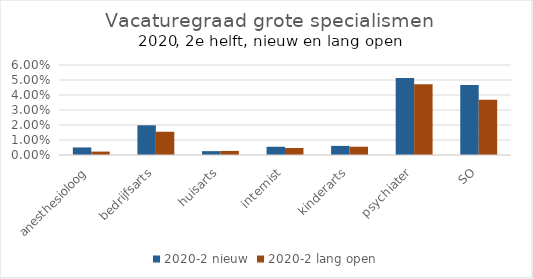
| Category | 2020-2 |
|---|---|
| anesthesioloog | 0.002 |
| bedrijfsarts | 0.015 |
| huisarts | 0.003 |
| internist | 0.005 |
| kinderarts | 0.006 |
| psychiater | 0.047 |
| SO | 0.037 |